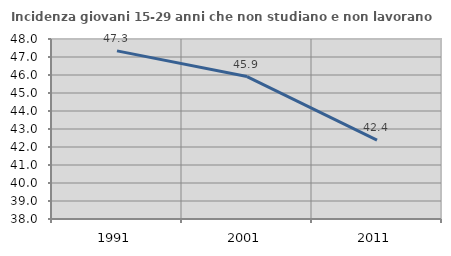
| Category | Incidenza giovani 15-29 anni che non studiano e non lavorano  |
|---|---|
| 1991.0 | 47.341 |
| 2001.0 | 45.912 |
| 2011.0 | 42.384 |